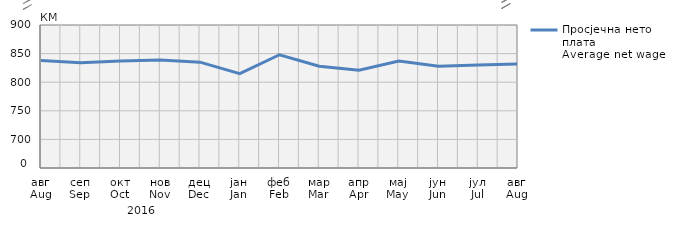
| Category | Просјечна нето плата
Average net wage |
|---|---|
| авг
Aug | 838 |
| сеп
Sep | 834 |
| окт
Oct | 837 |
| нов
Nov | 839 |
| дец
Dec | 835 |
| јан
Jan | 815 |
| феб
Feb | 848 |
| мар
Mar | 828 |
| апр
Apr | 821 |
| мај
May | 837 |
| јун
Jun | 828 |
| јул
Jul | 830 |
| авг
Aug | 832 |